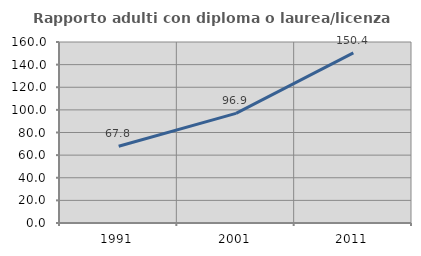
| Category | Rapporto adulti con diploma o laurea/licenza media  |
|---|---|
| 1991.0 | 67.809 |
| 2001.0 | 96.934 |
| 2011.0 | 150.36 |